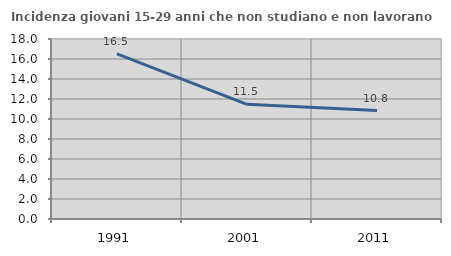
| Category | Incidenza giovani 15-29 anni che non studiano e non lavorano  |
|---|---|
| 1991.0 | 16.505 |
| 2001.0 | 11.467 |
| 2011.0 | 10.843 |